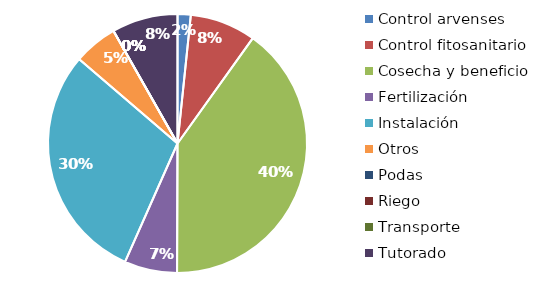
| Category | Valor |
|---|---|
| Control arvenses | 75000 |
| Control fitosanitario | 375000 |
| Cosecha y beneficio | 1830000 |
| Fertilización | 300000 |
| Instalación | 1350000 |
| Otros | 250000 |
| Podas | 0 |
| Riego | 0 |
| Transporte | 0 |
| Tutorado | 375000 |